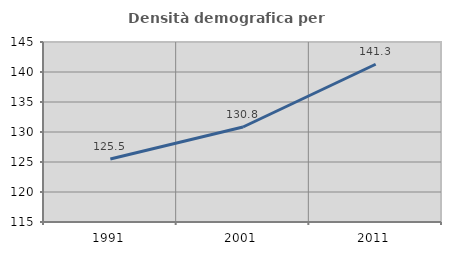
| Category | Densità demografica |
|---|---|
| 1991.0 | 125.5 |
| 2001.0 | 130.832 |
| 2011.0 | 141.29 |